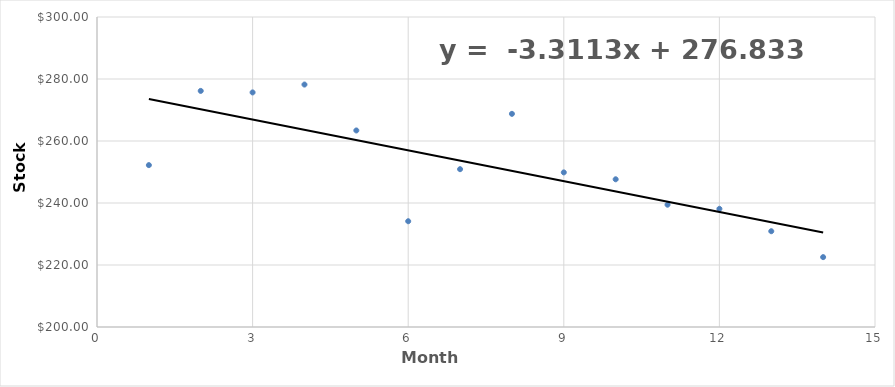
| Category | Series 0 |
|---|---|
| 1.0 | 252.22 |
| 2.0 | 276.16 |
| 3.0 | 275.67 |
| 4.0 | 278.21 |
| 5.0 | 263.4 |
| 6.0 | 234.12 |
| 7.0 | 250.91 |
| 8.0 | 268.76 |
| 9.0 | 249.87 |
| 10.0 | 247.65 |
| 11.0 | 239.45 |
| 12.0 | 238.12 |
| 13.0 | 230.9 |
| 14.0 | 222.54 |